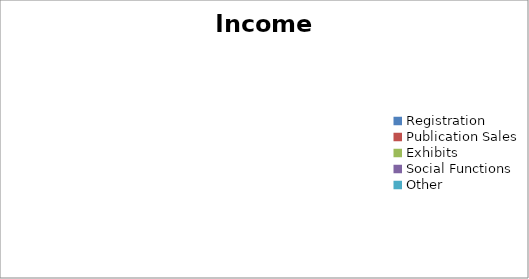
| Category | Income |
|---|---|
| Registration | 0 |
| Publication Sales | 0 |
| Exhibits | 0 |
| Social Functions | 0 |
| Other | 0 |